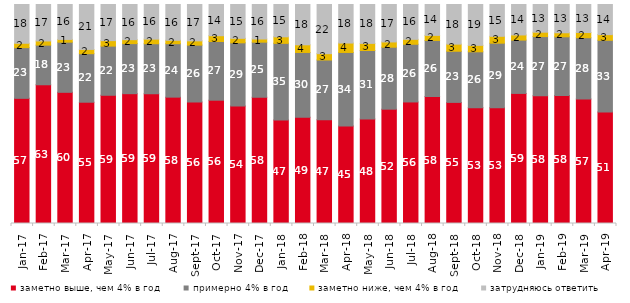
| Category | заметно выше, чем 4% в год | примерно 4% в год | заметно ниже, чем 4% в год | затрудняюсь ответить |
|---|---|---|---|---|
| 2017-01-01 | 57.15 | 23.15 | 2 | 17.7 |
| 2017-02-01 | 63.35 | 18.1 | 1.9 | 16.65 |
| 2017-03-01 | 59.9 | 22.9 | 1.25 | 15.95 |
| 2017-04-01 | 55.35 | 22.15 | 1.95 | 20.5 |
| 2017-05-01 | 58.55 | 22.45 | 2.5 | 16.5 |
| 2017-06-01 | 59.25 | 22.85 | 1.8 | 16.05 |
| 2017-07-01 | 59.2 | 22.85 | 2.1 | 15.8 |
| 2017-08-01 | 57.7 | 24.4 | 1.55 | 16.35 |
| 2017-09-01 | 55.5 | 25.95 | 1.95 | 16.6 |
| 2017-10-01 | 56.3 | 26.8 | 2.65 | 14.25 |
| 2017-11-01 | 53.6 | 28.9 | 2.05 | 15.45 |
| 2017-12-01 | 57.65 | 25.15 | 1.45 | 15.75 |
| 2018-01-01 | 47.25 | 35 | 3 | 14.75 |
| 2018-02-01 | 48.5 | 29.6 | 3.5 | 18.4 |
| 2018-03-01 | 47.4 | 27.25 | 2.9 | 22.45 |
| 2018-04-01 | 44.55 | 33.55 | 4.3 | 17.6 |
| 2018-05-01 | 47.7 | 31.3 | 3.25 | 17.75 |
| 2018-06-01 | 52.2 | 28.3 | 2.4 | 17.1 |
| 2018-07-01 | 55.5 | 26.35 | 2.25 | 15.9 |
| 2018-08-01 | 57.95 | 25.65 | 2.3 | 14.1 |
| 2018-09-01 | 55.3 | 23.35 | 3.25 | 18.1 |
| 2018-10-01 | 52.85 | 25.55 | 2.95 | 18.65 |
| 2018-11-01 | 52.844 | 29.491 | 3.144 | 14.521 |
| 2018-12-01 | 59.4 | 24.35 | 2.35 | 13.9 |
| 2019-01-01 | 58.3 | 27.05 | 2 | 12.65 |
| 2019-02-01 | 58.45 | 26.8 | 1.85 | 12.9 |
| 2019-03-01 | 56.887 | 27.946 | 2.387 | 12.78 |
| 2019-04-01 | 50.891 | 32.772 | 2.574 | 13.762 |